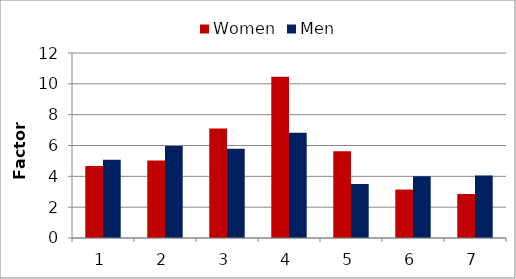
| Category | Women | Men |
|---|---|---|
| 1.0 | 4.665 | 5.076 |
| 2.0 | 5.02 | 5.974 |
| 3.0 | 7.095 | 5.794 |
| 4.0 | 10.466 | 6.835 |
| 5.0 | 5.627 | 3.504 |
| 6.0 | 3.141 | 4.006 |
| 7.0 | 2.856 | 4.06 |